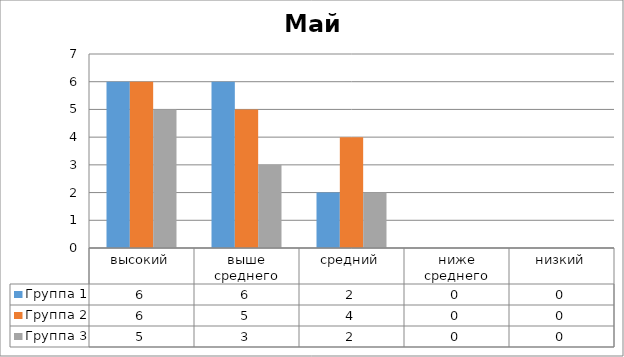
| Category | Группа 1 | Группа 2 | Группа 3 |
|---|---|---|---|
| высокий | 6 | 6 | 5 |
| выше среднего | 6 | 5 | 3 |
| средний | 2 | 4 | 2 |
| ниже среднего | 0 | 0 | 0 |
| низкий | 0 | 0 | 0 |